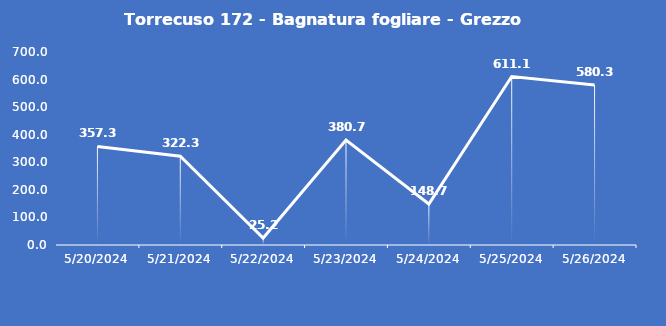
| Category | Torrecuso 172 - Bagnatura fogliare - Grezzo (min) |
|---|---|
| 5/20/24 | 357.3 |
| 5/21/24 | 322.3 |
| 5/22/24 | 25.2 |
| 5/23/24 | 380.7 |
| 5/24/24 | 148.7 |
| 5/25/24 | 611.1 |
| 5/26/24 | 580.3 |